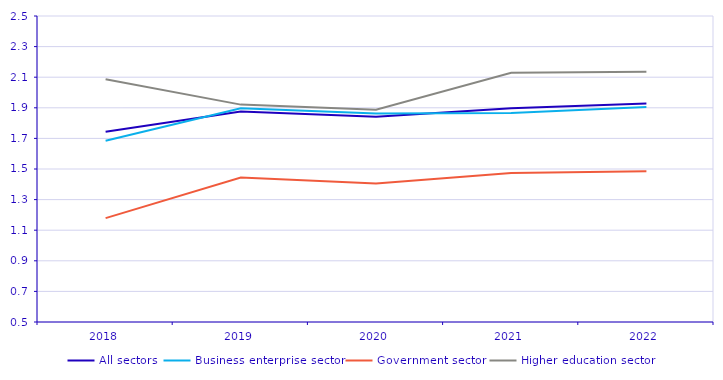
| Category | All sectors | Business enterprise sector | Government sector | Higher education sector |
|---|---|---|---|---|
| 2018 | 1.743 | 1.684 | 1.179 | 2.087 |
| 2019 | 1.876 | 1.897 | 1.444 | 1.921 |
| 2020 | 1.842 | 1.862 | 1.406 | 1.887 |
| 2021 | 1.897 | 1.865 | 1.473 | 2.129 |
| 2022 | 1.928 | 1.905 | 1.486 | 2.135 |